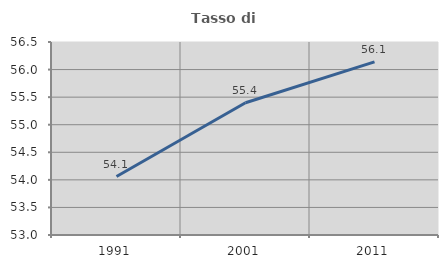
| Category | Tasso di occupazione   |
|---|---|
| 1991.0 | 54.06 |
| 2001.0 | 55.398 |
| 2011.0 | 56.139 |